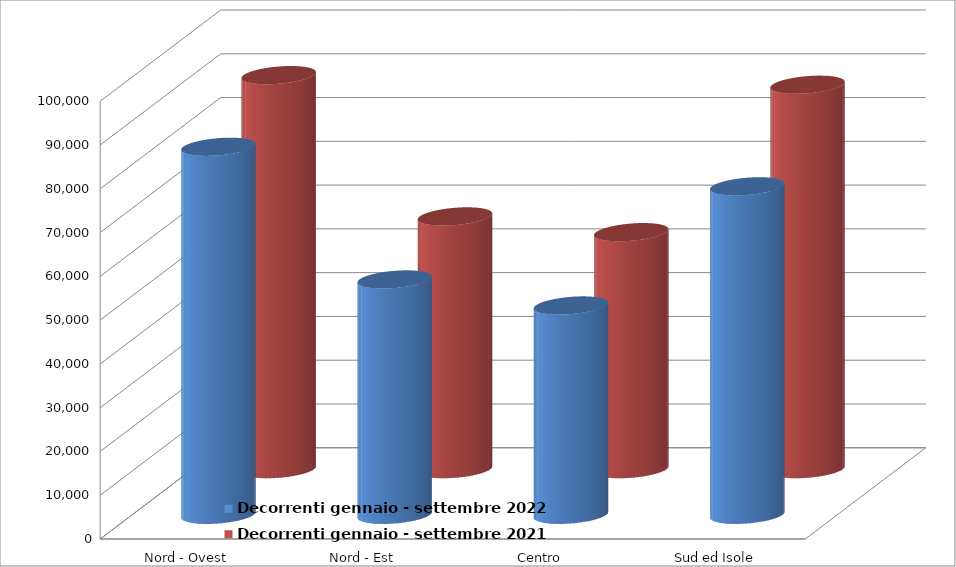
| Category | Decorrenti gennaio - settembre 2022 | Decorrenti gennaio - settembre 2021 |
|---|---|---|
| Nord - Ovest | 84073 | 90019 |
| Nord - Est | 53771 | 57745 |
| Centro | 47821 | 54150 |
| Sud ed Isole | 75041 | 87824 |